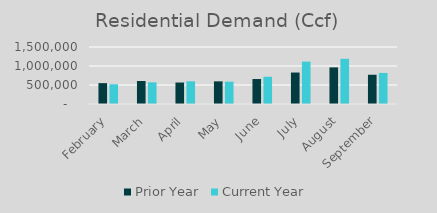
| Category | Prior Year | Current Year |
|---|---|---|
| February | 548904 | 520118 |
| March | 604606 | 569686 |
| April | 564867 | 597404.2 |
| May | 596051 | 588003 |
| June | 657143 | 716727.85 |
| July | 828101 | 1115755.73 |
| August | 963307 | 1189123.13 |
| September | 769938 | 816948.37 |